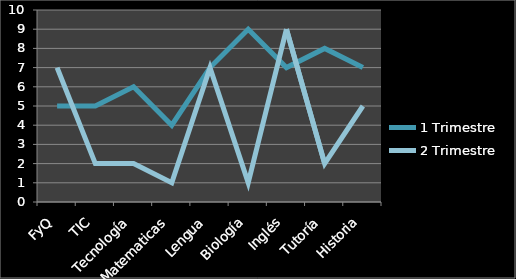
| Category | 1 Trimestre | 2 Trimestre |
|---|---|---|
| FyQ | 5 | 7 |
| TIC | 5 | 2 |
| Tecnología | 6 | 2 |
| Matematicas | 4 | 1 |
| Lengua | 7 | 7 |
| Biología | 9 | 1 |
| Inglés | 7 | 9 |
| Tutoría | 8 | 2 |
| Historia | 7 | 5 |